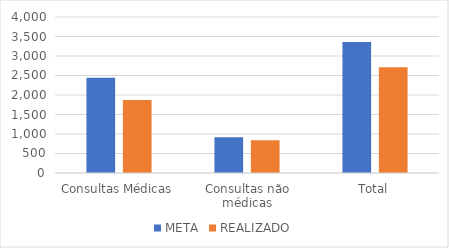
| Category | META | REALIZADO |
|---|---|---|
| Consultas Médicas | 2442 | 1869 |
| Consultas não médicas | 916 | 840 |
| Total | 3358 | 2709 |